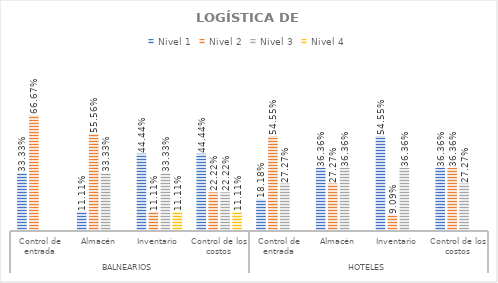
| Category | Nivel 1 | Nivel 2 | Nivel 3 | Nivel 4 |
|---|---|---|---|---|
| 0 | 0.333 | 0.667 | 0 | 0 |
| 1 | 0.111 | 0.556 | 0.333 | 0 |
| 2 | 0.444 | 0.111 | 0.333 | 0.111 |
| 3 | 0.444 | 0.222 | 0.222 | 0.111 |
| 4 | 0.182 | 0.545 | 0.273 | 0 |
| 5 | 0.364 | 0.273 | 0.364 | 0 |
| 6 | 0.545 | 0.091 | 0.364 | 0 |
| 7 | 0.364 | 0.364 | 0.273 | 0 |